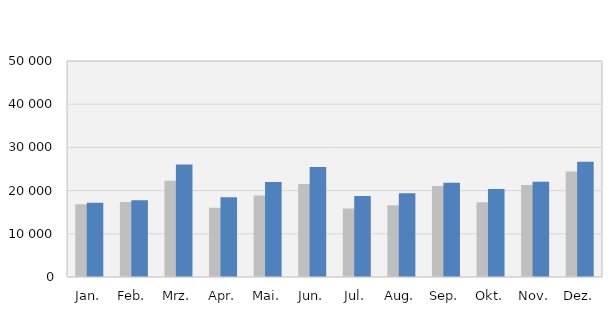
| Category | 2022 | 2023 |
|---|---|---|
| Jan. | 16812 | 17170 |
| Feb. | 17363 | 17785 |
| Mrz. | 22291 | 26048 |
| Apr. | 16041 | 18447 |
| Mai. | 18846 | 21976 |
| Jun. | 21522 | 25486 |
| Jul. | 15879 | 18767 |
| Aug. | 16607 | 19385 |
| Sep. | 21089 | 21844 |
| Okt. | 17281 | 20397 |
| Nov. | 21273 | 22025 |
| Dez. | 24399 | 26651 |